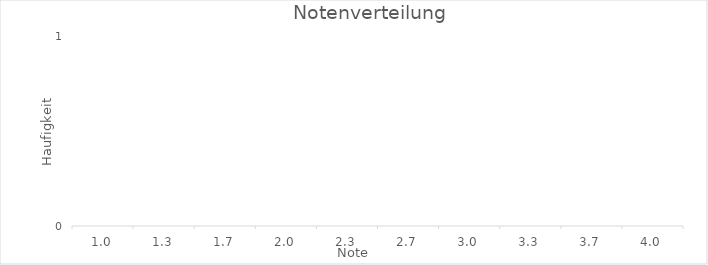
| Category | Series 0 |
|---|---|
| 1.0 | 0 |
| 1.3 | 0 |
| 1.7 | 0 |
| 2.0 | 0 |
| 2.3 | 0 |
| 2.7 | 0 |
| 3.0 | 0 |
| 3.3 | 0 |
| 3.7 | 0 |
| 4.0 | 0 |